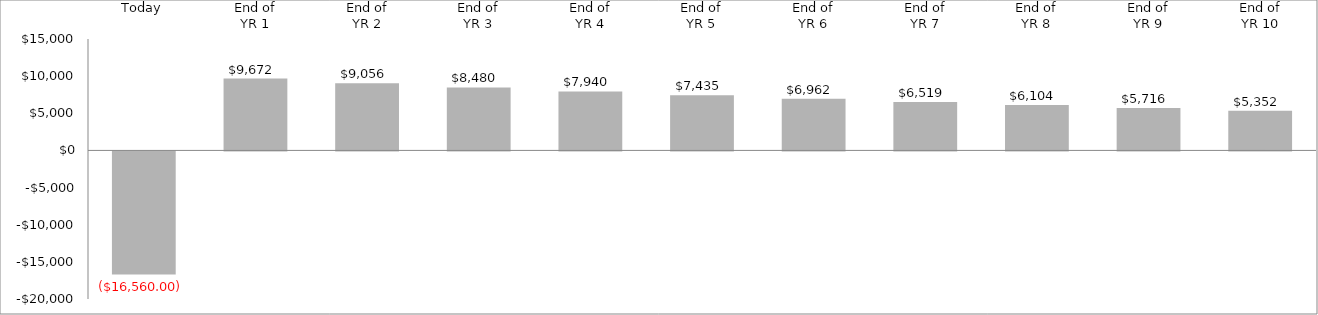
| Category | ($16,560.00) $9,672  $9,056  $8,480  $7,940  $7,435  $6,962  $6,519  $6,104  $5,716  $5,352  |
|---|---|
| Today | -16560 |
| End of
YR 1 | 9671.818 |
| End of
YR 2 | 9056.339 |
| End of
YR 3 | 8480.026 |
| End of
YR 4 | 7940.388 |
| End of
YR 5 | 7435.091 |
| End of
YR 6 | 6961.949 |
| End of
YR 7 | 6518.916 |
| End of
YR 8 | 6104.076 |
| End of
YR 9 | 5715.634 |
| End of
YR 10 | 5351.912 |